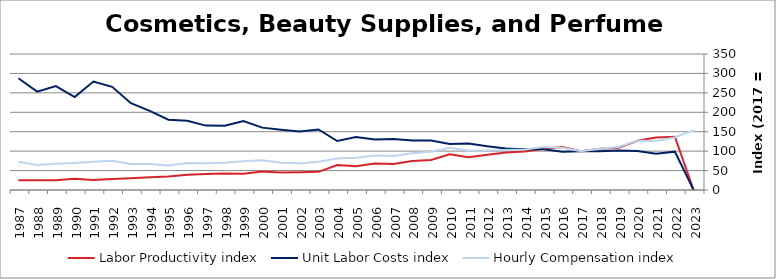
| Category | Labor Productivity index | Unit Labor Costs index | Hourly Compensation index |
|---|---|---|---|
| 2023.0 | 0 | 0 | 153.717 |
| 2022.0 | 137.137 | 98.676 | 135.322 |
| 2021.0 | 134.844 | 93.344 | 125.869 |
| 2020.0 | 126.737 | 100.214 | 127.008 |
| 2019.0 | 108.445 | 101.95 | 110.56 |
| 2018.0 | 106.314 | 100.022 | 106.338 |
| 2017.0 | 100 | 100 | 100 |
| 2016.0 | 110.497 | 98.335 | 108.656 |
| 2015.0 | 105.967 | 104.686 | 110.933 |
| 2014.0 | 98.87 | 105.189 | 104.001 |
| 2013.0 | 96.418 | 107.086 | 103.25 |
| 2012.0 | 90.543 | 112.441 | 101.807 |
| 2011.0 | 84.293 | 119.817 | 100.997 |
| 2010.0 | 92.14 | 118.162 | 108.875 |
| 2009.0 | 77.281 | 127.262 | 98.35 |
| 2008.0 | 74.505 | 127.259 | 94.814 |
| 2007.0 | 66.785 | 131.076 | 87.539 |
| 2006.0 | 68.347 | 130.065 | 88.895 |
| 2005.0 | 61.151 | 136.112 | 83.234 |
| 2004.0 | 64.256 | 126 | 80.963 |
| 2003.0 | 46.786 | 155.809 | 72.898 |
| 2002.0 | 45.6 | 150.277 | 68.526 |
| 2001.0 | 45.331 | 155.057 | 70.289 |
| 2000.0 | 47.519 | 160.502 | 76.27 |
| 1999.0 | 41.569 | 177.589 | 73.822 |
| 1998.0 | 42.44 | 165.572 | 70.268 |
| 1997.0 | 41.386 | 165.713 | 68.581 |
| 1996.0 | 39.196 | 177.926 | 69.74 |
| 1995.0 | 34.852 | 180.772 | 63.002 |
| 1994.0 | 32.768 | 203.61 | 66.718 |
| 1993.0 | 30.069 | 223.38 | 67.169 |
| 1992.0 | 28.417 | 265.522 | 75.453 |
| 1991.0 | 25.977 | 279.224 | 72.534 |
| 1990.0 | 29.175 | 239.216 | 69.791 |
| 1989.0 | 25.324 | 267.315 | 67.696 |
| 1988.0 | 25.377 | 253.106 | 64.23 |
| 1987.0 | 25.218 | 287.455 | 72.492 |